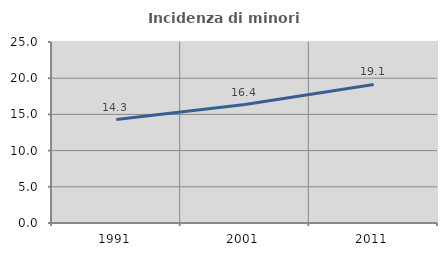
| Category | Incidenza di minori stranieri |
|---|---|
| 1991.0 | 14.286 |
| 2001.0 | 16.364 |
| 2011.0 | 19.136 |